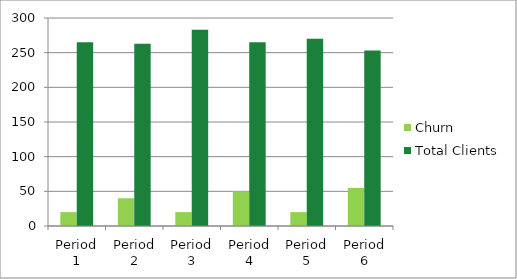
| Category | Churn | Total Clients |
|---|---|---|
| Period 1 | 20 | 265 |
| Period 2 | 40 | 263 |
| Period 3 | 20 | 283 |
| Period 4 | 50 | 265 |
| Period 5 | 20 | 270 |
| Period 6 | 55 | 253 |